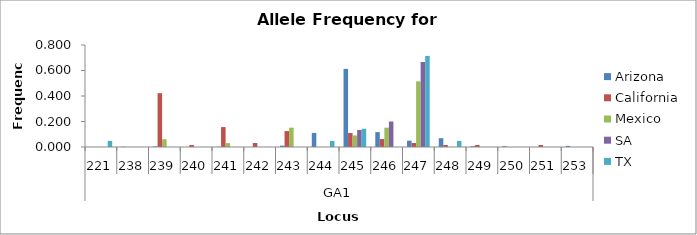
| Category | Arizona | California | Mexico | SA | TX |
|---|---|---|---|---|---|
| 0 | 0 | 0 | 0 | 0 | 0.048 |
| 1 | 0.002 | 0 | 0 | 0 | 0 |
| 2 | 0.004 | 0.422 | 0.061 | 0 | 0 |
| 3 | 0 | 0.016 | 0 | 0 | 0 |
| 4 | 0.002 | 0.156 | 0.03 | 0 | 0 |
| 5 | 0 | 0.031 | 0 | 0 | 0 |
| 6 | 0.011 | 0.125 | 0.152 | 0 | 0 |
| 7 | 0.11 | 0 | 0 | 0 | 0.048 |
| 8 | 0.613 | 0.109 | 0.091 | 0.133 | 0.143 |
| 9 | 0.117 | 0.062 | 0.152 | 0.2 | 0 |
| 10 | 0.05 | 0.031 | 0.515 | 0.667 | 0.714 |
| 11 | 0.069 | 0.016 | 0 | 0 | 0.048 |
| 12 | 0.006 | 0.016 | 0 | 0 | 0 |
| 13 | 0.006 | 0 | 0 | 0 | 0 |
| 14 | 0 | 0.016 | 0 | 0 | 0 |
| 15 | 0.009 | 0 | 0 | 0 | 0 |